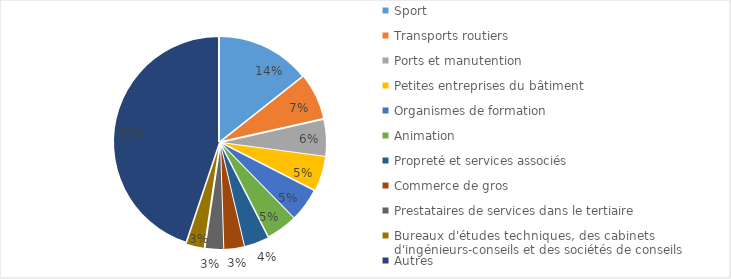
| Category | part |
|---|---|
| Sport | 0.144 |
| Transports routiers | 0.071 |
| Ports et manutention | 0.056 |
| Petites entreprises du bâtiment | 0.054 |
| Organismes de formation | 0.052 |
| Animation | 0.048 |
| Propreté et services associés | 0.038 |
| Commerce de gros | 0.032 |
| Prestataires de services dans le tertiaire | 0.028 |
| Bureaux d'études techniques, des cabinets d'ingénieurs-conseils et des sociétés de conseils | 0.028 |
| Autres | 0.449 |